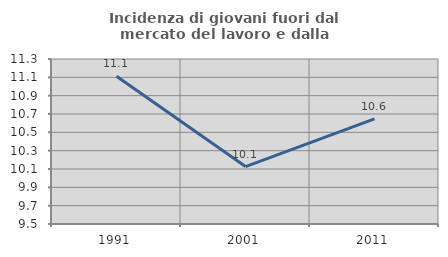
| Category | Incidenza di giovani fuori dal mercato del lavoro e dalla formazione  |
|---|---|
| 1991.0 | 11.111 |
| 2001.0 | 10.127 |
| 2011.0 | 10.646 |